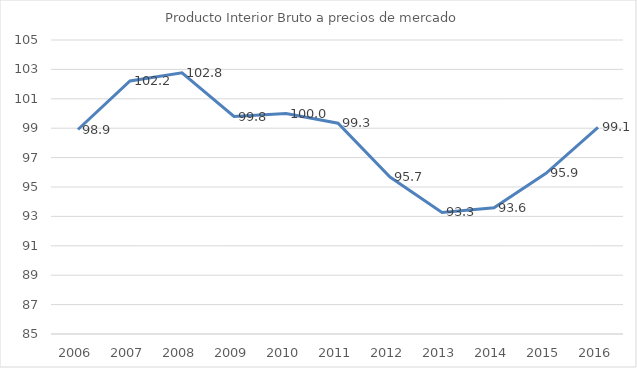
| Category | Producto Interior Bruto a precios de mercado |
|---|---|
| 2006.0 | 98.91 |
| 2007.0 | 102.211 |
| 2008.0 | 102.763 |
| 2009.0 | 99.795 |
| 2010.0 | 100 |
| 2011.0 | 99.338 |
| 2012.0 | 95.673 |
| 2013.0 | 93.269 |
| 2014.0 | 93.582 |
| 2015.0 | 95.928 |
| 2016.0 | 99.056 |